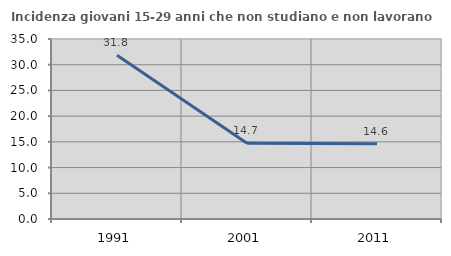
| Category | Incidenza giovani 15-29 anni che non studiano e non lavorano  |
|---|---|
| 1991.0 | 31.818 |
| 2001.0 | 14.748 |
| 2011.0 | 14.642 |